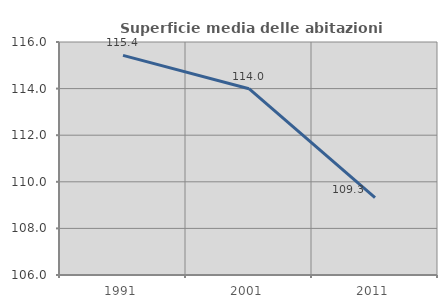
| Category | Superficie media delle abitazioni occupate |
|---|---|
| 1991.0 | 115.426 |
| 2001.0 | 113.996 |
| 2011.0 | 109.323 |